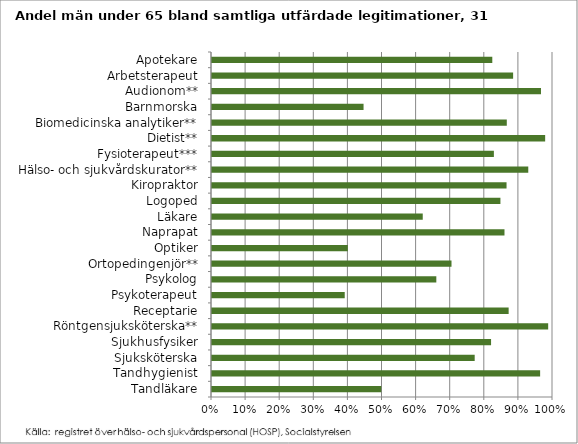
| Category | Män |
|---|---|
| Apotekare | 0.822 |
| Arbetsterapeut | 0.883 |
| Audionom** | 0.965 |
| Barnmorska | 0.444 |
| Biomedicinska analytiker** | 0.864 |
| Dietist** | 0.977 |
| Fysioterapeut*** | 0.827 |
| Hälso- och sjukvårdskurator** | 0.927 |
| Kiropraktor | 0.864 |
| Logoped | 0.846 |
| Läkare | 0.618 |
| Naprapat | 0.858 |
| Optiker | 0.398 |
| Ortopedingenjör** | 0.702 |
| Psykolog | 0.658 |
| Psykoterapeut | 0.389 |
| Receptarie | 0.87 |
| Röntgensjuksköterska** | 0.986 |
| Sjukhusfysiker | 0.818 |
| Sjuksköterska | 0.77 |
| Tandhygienist | 0.962 |
| Tandläkare | 0.496 |